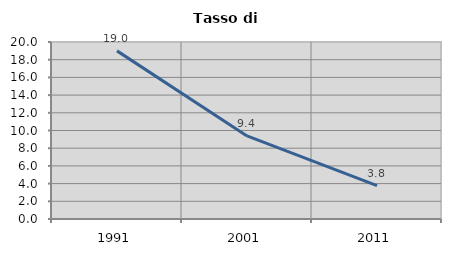
| Category | Tasso di disoccupazione   |
|---|---|
| 1991.0 | 18.998 |
| 2001.0 | 9.392 |
| 2011.0 | 3.781 |